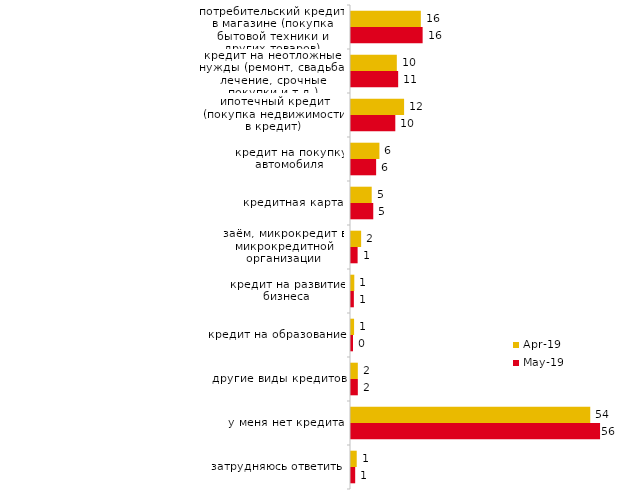
| Category | апр.19 | май.19 |
|---|---|---|
| потребительский кредит в магазине (покупка бытовой техники и других товаров) | 15.693 | 16.097 |
| кредит на неотложные нужды (ремонт, свадьба, лечение, срочные покупки и т.д.) | 10.297 | 10.599 |
| ипотечный кредит (покупка недвижимости в кредит) | 11.931 | 9.955 |
| кредит на покупку автомобиля | 6.386 | 5.646 |
| кредитная карта | 4.653 | 5.002 |
| заём, микрокредит в микрокредитной организации | 2.277 | 1.486 |
| кредит на развитие бизнеса | 0.743 | 0.644 |
| кредит на образование | 0.693 | 0.446 |
| другие виды кредитов | 1.535 | 1.535 |
| у меня нет кредита | 53.762 | 55.968 |
| затрудняюсь ответить | 1.287 | 0.941 |